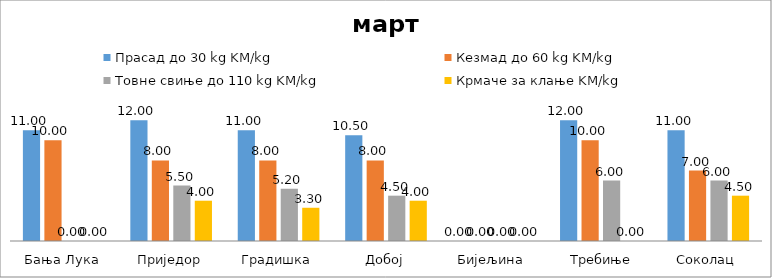
| Category | Прасад до 30 kg | Кезмад до 60 kg | Товне свиње до 110 kg | Крмаче за клање |
|---|---|---|---|---|
| Бања Лука | 11 | 10 | 0 | 0 |
| Приједор | 12 | 8 | 5.5 | 4 |
| Градишка | 11 | 8 | 5.2 | 3.3 |
| Добој | 10.5 | 8 | 4.5 | 4 |
| Бијељина | 0 | 0 | 0 | 0 |
|  Требиње | 12 | 10 | 6 | 0 |
| Соколац | 11 | 7 | 6 | 4.5 |